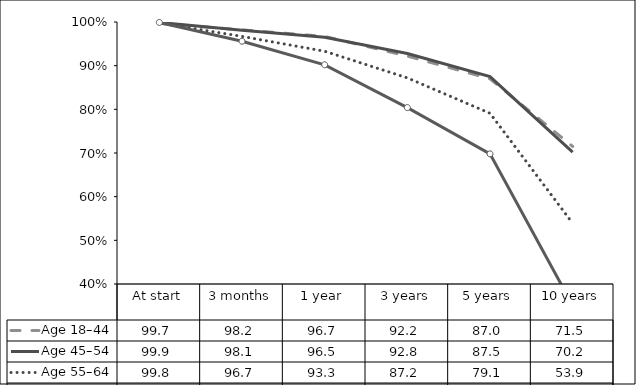
| Category | Age 18–44  | Age 45–54  | Age 55–64  | Age 65+  |
|---|---|---|---|---|
| At start | 99.7 | 99.9 | 99.8 | 99.9 |
| 3 months | 98.2 | 98.1 | 96.7 | 95.6 |
| 1 year | 96.7 | 96.5 | 93.3 | 90.2 |
| 3 years | 92.2 | 92.8 | 87.2 | 80.4 |
| 5 years | 87 | 87.5 | 79.1 | 69.8 |
| 10 years | 71.5 | 70.2 | 53.9 | 35.1 |